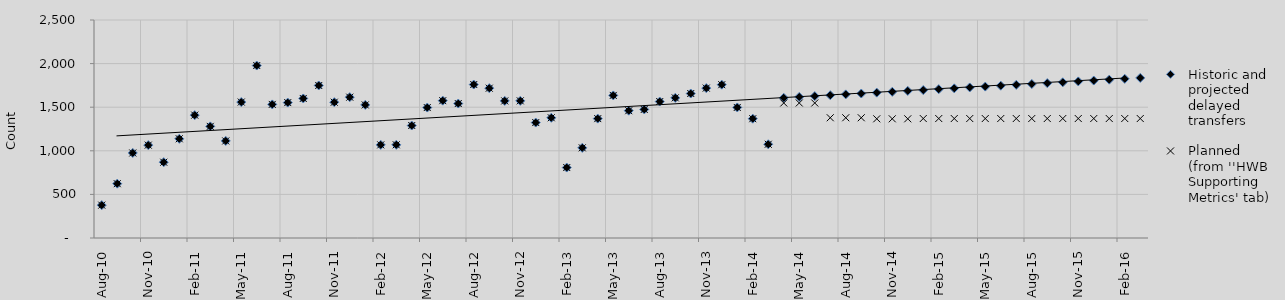
| Category | Historic and projected delayed transfers | Planned (from ''HWB Supporting Metrics' tab) |
|---|---|---|
| 2010-08-01 | 377 | 377 |
| 2010-09-01 | 623 | 623 |
| 2010-10-01 | 975 | 975 |
| 2010-11-01 | 1065 | 1065 |
| 2010-12-01 | 869 | 869 |
| 2011-01-01 | 1138 | 1138 |
| 2011-02-01 | 1409 | 1409 |
| 2011-03-01 | 1280 | 1280 |
| 2011-04-01 | 1113 | 1113 |
| 2011-05-01 | 1559 | 1559 |
| 2011-06-01 | 1978 | 1978 |
| 2011-07-01 | 1532 | 1532 |
| 2011-08-01 | 1553 | 1553 |
| 2011-09-01 | 1600 | 1600 |
| 2011-10-01 | 1749 | 1749 |
| 2011-11-01 | 1557 | 1557 |
| 2011-12-01 | 1615 | 1615 |
| 2012-01-01 | 1526 | 1526 |
| 2012-02-01 | 1068 | 1068 |
| 2012-03-01 | 1069 | 1069 |
| 2012-04-01 | 1290 | 1290 |
| 2012-05-01 | 1496 | 1496 |
| 2012-06-01 | 1575 | 1575 |
| 2012-07-01 | 1542 | 1542 |
| 2012-08-01 | 1760 | 1760 |
| 2012-09-01 | 1718 | 1718 |
| 2012-10-01 | 1572 | 1572 |
| 2012-11-01 | 1573 | 1573 |
| 2012-12-01 | 1324 | 1324 |
| 2013-01-01 | 1379 | 1379 |
| 2013-02-01 | 808 | 808 |
| 2013-03-01 | 1034 | 1034 |
| 2013-04-01 | 1369 | 1369 |
| 2013-05-01 | 1635 | 1635 |
| 2013-06-01 | 1460 | 1460 |
| 2013-07-01 | 1474 | 1474 |
| 2013-08-01 | 1565 | 1565 |
| 2013-09-01 | 1607 | 1607 |
| 2013-10-01 | 1657 | 1657 |
| 2013-11-01 | 1719 | 1719 |
| 2013-12-01 | 1758 | 1758 |
| 2014-01-01 | 1497 | 1497 |
| 2014-02-01 | 1368 | 1368 |
| 2014-03-01 | 1075 | 1075 |
| 2014-04-01 | 1607.393 | 1548.333 |
| 2014-05-01 | 1617.308 | 1548.333 |
| 2014-06-01 | 1627.222 | 1548.333 |
| 2014-07-01 | 1637.137 | 1379 |
| 2014-08-01 | 1647.051 | 1379 |
| 2014-09-01 | 1656.965 | 1379 |
| 2014-10-01 | 1666.88 | 1367 |
| 2014-11-01 | 1676.794 | 1367 |
| 2014-12-01 | 1686.709 | 1367 |
| 2015-01-01 | 1696.623 | 1370 |
| 2015-02-01 | 1706.538 | 1370 |
| 2015-03-01 | 1716.452 | 1370 |
| 2015-04-01 | 1726.367 | 1370 |
| 2015-05-01 | 1736.281 | 1370 |
| 2015-06-01 | 1746.195 | 1370 |
| 2015-07-01 | 1756.11 | 1370 |
| 2015-08-01 | 1766.024 | 1370 |
| 2015-09-01 | 1775.939 | 1370 |
| 2015-10-01 | 1785.853 | 1370 |
| 2015-11-01 | 1795.768 | 1370 |
| 2015-12-01 | 1805.682 | 1370 |
| 2016-01-01 | 1815.597 | 1370 |
| 2016-02-01 | 1825.511 | 1370 |
| 2016-03-01 | 1835.426 | 1370 |